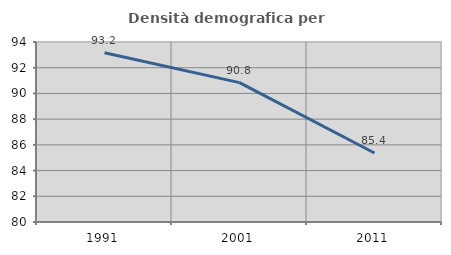
| Category | Densità demografica |
|---|---|
| 1991.0 | 93.167 |
| 2001.0 | 90.838 |
| 2011.0 | 85.365 |